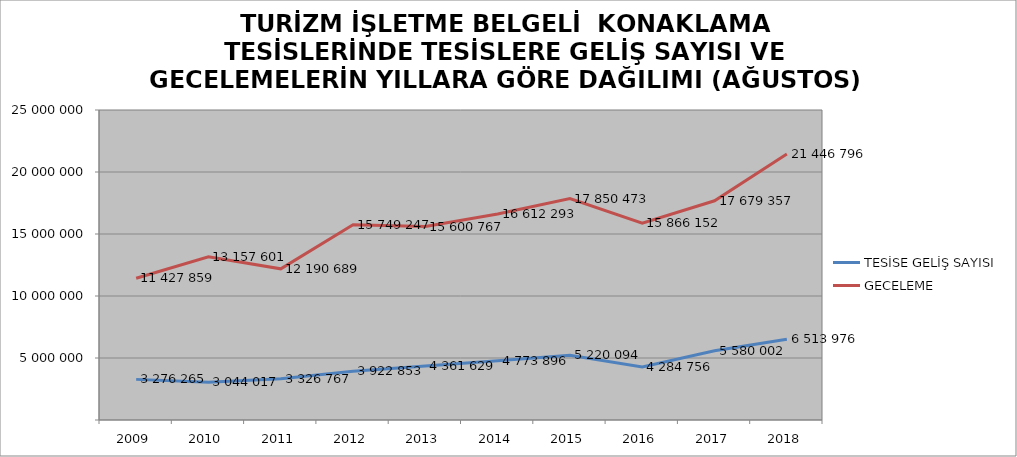
| Category | TESİSE GELİŞ SAYISI | GECELEME |
|---|---|---|
| 2009 | 3276265 | 11427859 |
| 2010 | 3044017 | 13157601 |
| 2011 | 3326767 | 12190689 |
| 2012 | 3922853 | 15749247 |
| 2013 | 4361629 | 15600767 |
| 2014 | 4773896 | 16612293 |
| 2015 | 5220094 | 17850473 |
| 2016 | 4284756 | 15866152 |
| 2017 | 5580002 | 17679357 |
| 2018 | 6513976 | 21446796 |